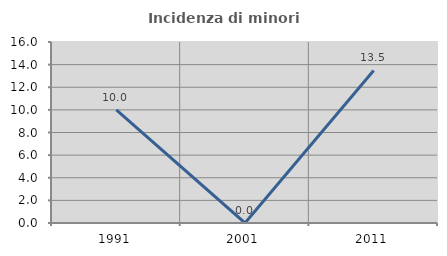
| Category | Incidenza di minori stranieri |
|---|---|
| 1991.0 | 10 |
| 2001.0 | 0 |
| 2011.0 | 13.483 |